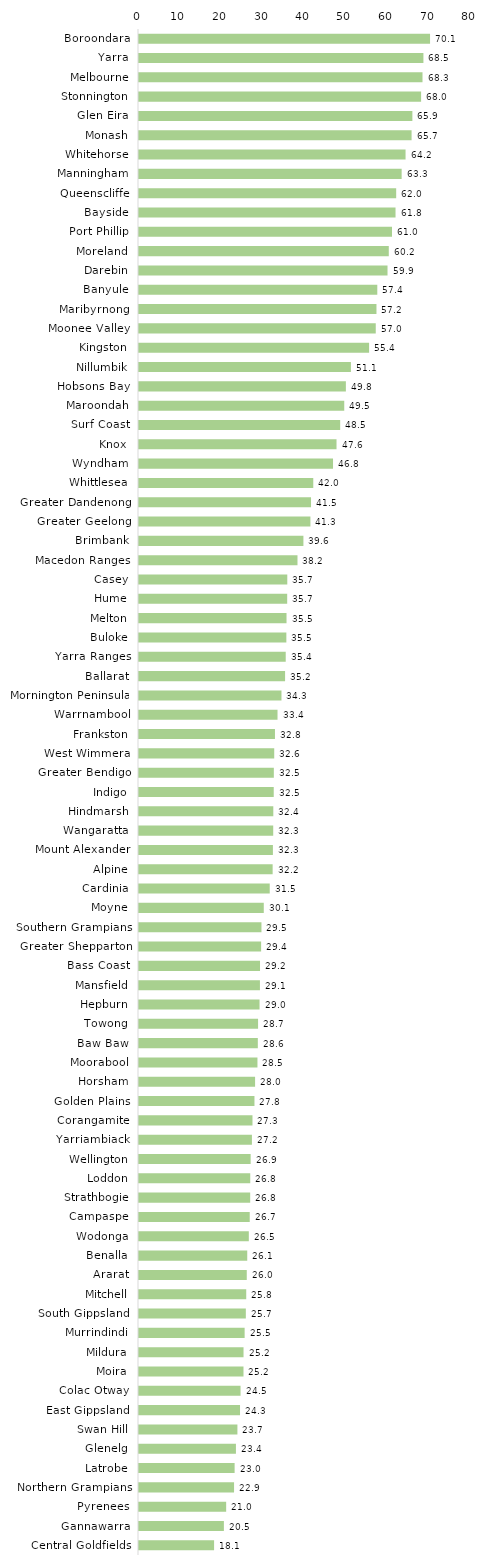
| Category | Series 0 |
|---|---|
| Boroondara | 70.132 |
| Yarra | 68.535 |
| Melbourne | 68.314 |
| Stonnington | 67.976 |
| Glen Eira | 65.874 |
| Monash | 65.683 |
| Whitehorse | 64.23 |
| Manningham | 63.288 |
| Queenscliffe | 61.972 |
| Bayside | 61.814 |
| Port Phillip | 60.965 |
| Moreland | 60.189 |
| Darebin | 59.884 |
| Banyule | 57.419 |
| Maribyrnong | 57.221 |
| Moonee Valley | 57.049 |
| Kingston | 55.446 |
| Nillumbik | 51.061 |
| Hobsons Bay | 49.849 |
| Maroondah | 49.458 |
| Surf Coast | 48.478 |
| Knox | 47.596 |
| Wyndham | 46.753 |
| Whittlesea | 41.992 |
| Greater Dandenong | 41.451 |
| Greater Geelong | 41.304 |
| Brimbank | 39.617 |
| Macedon Ranges | 38.191 |
| Casey | 35.731 |
| Hume | 35.708 |
| Melton | 35.547 |
| Buloke | 35.507 |
| Yarra Ranges | 35.356 |
| Ballarat | 35.199 |
| Mornington Peninsula | 34.33 |
| Warrnambool | 33.377 |
| Frankston | 32.763 |
| West Wimmera | 32.584 |
| Greater Bendigo | 32.49 |
| Indigo | 32.466 |
| Hindmarsh | 32.362 |
| Wangaratta | 32.342 |
| Mount Alexander | 32.266 |
| Alpine | 32.203 |
| Cardinia | 31.502 |
| Moyne | 30.067 |
| Southern Grampians | 29.506 |
| Greater Shepparton | 29.427 |
| Bass Coast | 29.162 |
| Mansfield | 29.139 |
| Hepburn | 29.047 |
| Towong | 28.692 |
| Baw Baw | 28.632 |
| Moorabool | 28.542 |
| Horsham | 27.972 |
| Golden Plains | 27.822 |
| Corangamite | 27.345 |
| Yarriambiack | 27.211 |
| Wellington | 26.903 |
| Loddon | 26.807 |
| Strathbogie | 26.793 |
| Campaspe | 26.683 |
| Wodonga | 26.462 |
| Benalla | 26.081 |
| Ararat | 25.968 |
| Mitchell | 25.84 |
| South Gippsland | 25.743 |
| Murrindindi | 25.455 |
| Mildura | 25.188 |
| Moira | 25.178 |
| Colac Otway | 24.469 |
| East Gippsland | 24.343 |
| Swan Hill | 23.713 |
| Glenelg | 23.358 |
| Latrobe | 23.04 |
| Northern Grampians | 22.904 |
| Pyrenees | 21.003 |
| Gannawarra | 20.455 |
| Central Goldfields | 18.092 |